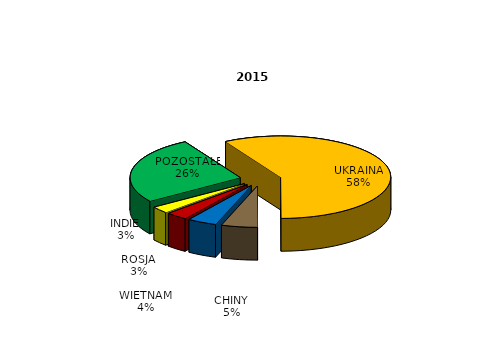
| Category | Series 0 |
|---|---|
| UKRAINA | 37833 |
| CHINY | 3447 |
| WIETNAM | 2789 |
| ROSJA | 2041 |
| INDIE | 1713 |
| POZOSTAŁE | 17103 |